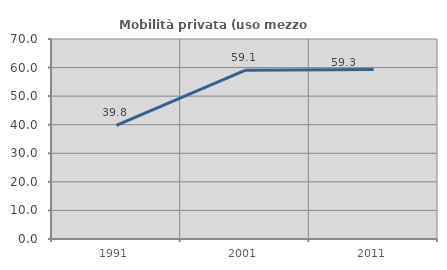
| Category | Mobilità privata (uso mezzo privato) |
|---|---|
| 1991.0 | 39.789 |
| 2001.0 | 59.055 |
| 2011.0 | 59.328 |